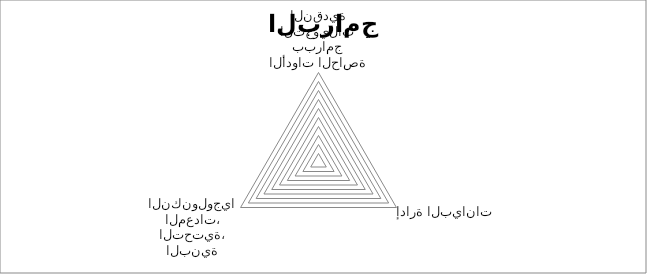
| Category | Series 0 |
|---|---|
| الأدوات الحاصة ببرامج التحويلات النقدية | 0 |
| إدارة البيانات | 0 |
| البنية التحتية، المعدات، النكنولوجيا | 0 |